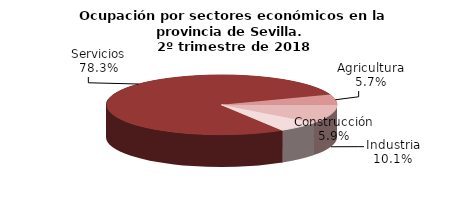
| Category | Series 0 |
|---|---|
| Agricultura | 41.1 |
| Industria | 73.3 |
| Construcción | 42.7 |
| Servicios | 565.8 |